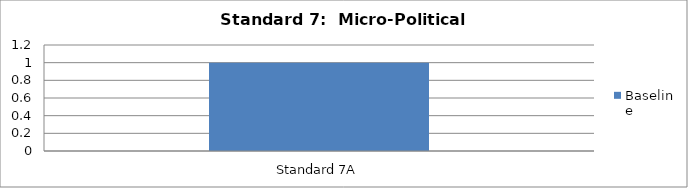
| Category | Baseline |
|---|---|
| Standard 7A | 1 |